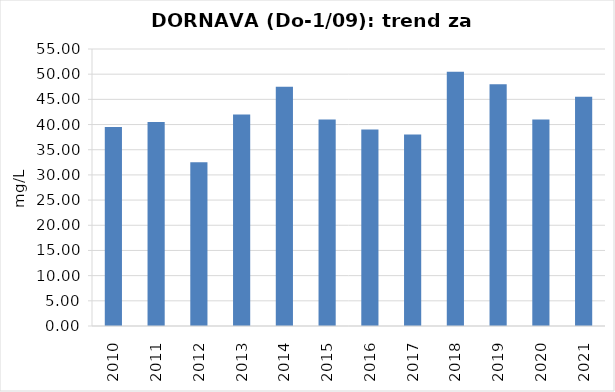
| Category | Vsota |
|---|---|
| 2010 | 39.5 |
| 2011 | 40.5 |
| 2012 | 32.5 |
| 2013 | 42 |
| 2014 | 47.5 |
| 2015 | 41 |
| 2016 | 39 |
| 2017 | 38 |
| 2018 | 50.5 |
| 2019 | 48 |
| 2020 | 41 |
| 2021 | 45.5 |